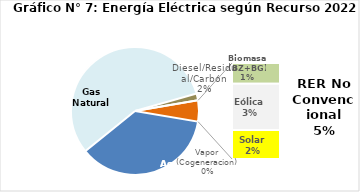
| Category | Series 0 |
|---|---|
| Agua | 1856.41 |
| Gas Natural | 2868.06 |
| Diesel/Residual/Carbón | 86.743 |
| Vapor (Cogeneracion) | 1.567 |
| Biomasa (BZ+BG) | 58.616 |
| Eólica | 131.262 |
| Solar | 81.91 |